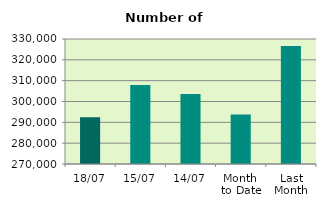
| Category | Series 0 |
|---|---|
| 18/07 | 292450 |
| 15/07 | 307958 |
| 14/07 | 303578 |
| Month 
to Date | 293726.833 |
| Last
Month | 326674.818 |